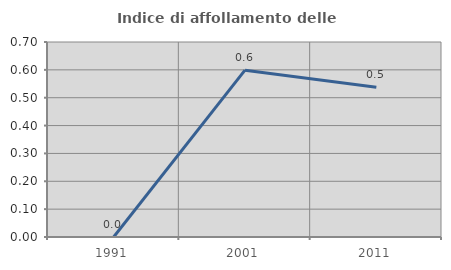
| Category | Indice di affollamento delle abitazioni  |
|---|---|
| 1991.0 | 0 |
| 2001.0 | 0.599 |
| 2011.0 | 0.538 |